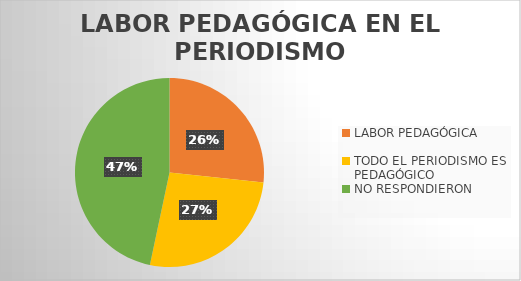
| Category | Series 0 |
|---|---|
| LABOR PEDAGÓGICA | 4 |
| TODO EL PERIODISMO ES PEDAGÓGICO | 4 |
| NO RESPONDIERON | 7 |